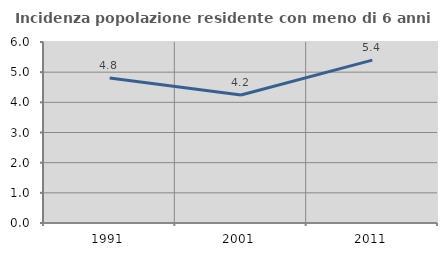
| Category | Incidenza popolazione residente con meno di 6 anni |
|---|---|
| 1991.0 | 4.805 |
| 2001.0 | 4.244 |
| 2011.0 | 5.399 |